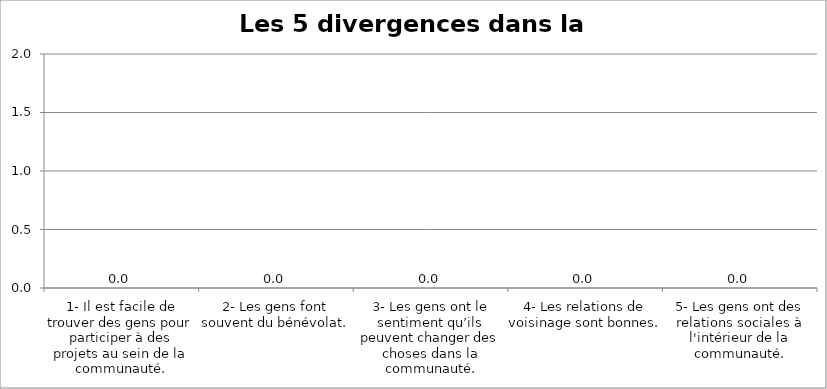
| Category | Les 5 divergences dans la communauté |
|---|---|
| 1- Il est facile de trouver des gens pour participer à des projets au sein de la communauté. | 0 |
| 2- Les gens font souvent du bénévolat. | 0 |
| 3- Les gens ont le sentiment qu’ils peuvent changer des choses dans la communauté. | 0 |
| 4- Les relations de voisinage sont bonnes. | 0 |
| 5- Les gens ont des relations sociales à l'intérieur de la communauté. | 0 |